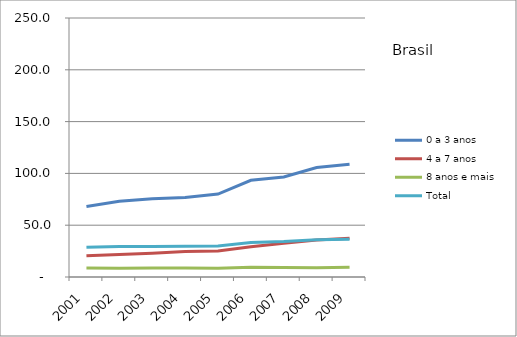
| Category | 0 a 3 anos | 4 a 7 anos | 8 anos e mais | Total |
|---|---|---|---|---|
| 2001.0 | 68.1 | 20.4 | 8.8 | 28.6 |
| 2002.0 | 73.1 | 21.7 | 8.5 | 29.4 |
| 2003.0 | 75.5 | 23 | 8.7 | 29.5 |
| 2004.0 | 76.8 | 24.7 | 8.6 | 29.8 |
| 2005.0 | 80.1 | 25 | 8.5 | 30 |
| 2006.0 | 93.3 | 29.1 | 9.3 | 33.4 |
| 2007.0 | 96.6 | 32.6 | 9.1 | 34.2 |
| 2008.0 | 105.7 | 35.7 | 9 | 35.9 |
| 2009.0 | 108.8 | 37.5 | 9.5 | 36.5 |